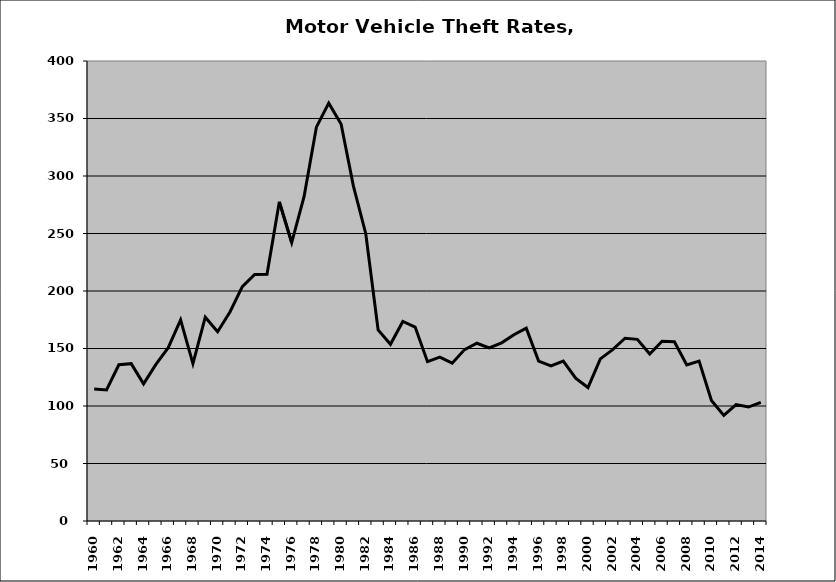
| Category | Motor Vehicle |
|---|---|
| 1960.0 | 114.826 |
| 1961.0 | 113.905 |
| 1962.0 | 135.89 |
| 1963.0 | 136.795 |
| 1964.0 | 119.242 |
| 1965.0 | 136.176 |
| 1966.0 | 150.76 |
| 1967.0 | 174.921 |
| 1968.0 | 136.825 |
| 1969.0 | 177.188 |
| 1970.0 | 164.553 |
| 1971.0 | 181.765 |
| 1972.0 | 203.768 |
| 1973.0 | 214.448 |
| 1974.0 | 214.485 |
| 1975.0 | 277.54 |
| 1976.0 | 242.051 |
| 1977.0 | 282.02 |
| 1978.0 | 342.453 |
| 1979.0 | 363.333 |
| 1980.0 | 345.236 |
| 1981.0 | 291.26 |
| 1982.0 | 249.801 |
| 1983.0 | 166.148 |
| 1984.0 | 153.62 |
| 1985.0 | 173.477 |
| 1986.0 | 168.639 |
| 1987.0 | 138.571 |
| 1988.0 | 142.463 |
| 1989.0 | 137.263 |
| 1990.0 | 149.034 |
| 1991.0 | 154.565 |
| 1992.0 | 150.429 |
| 1993.0 | 154.894 |
| 1994.0 | 161.975 |
| 1995.0 | 167.708 |
| 1996.0 | 139.085 |
| 1997.0 | 134.792 |
| 1998.0 | 139.085 |
| 1999.0 | 124.27 |
| 2000.0 | 116.043 |
| 2001.0 | 140.961 |
| 2002.0 | 148.949 |
| 2003.0 | 158.929 |
| 2004.0 | 157.94 |
| 2005.0 | 145.244 |
| 2006.0 | 156.309 |
| 2007.0 | 155.882 |
| 2008.0 | 135.652 |
| 2009.0 | 139.085 |
| 2010.0 | 104.857 |
| 2011.0 | 91.829 |
| 2012.0 | 101.279 |
| 2013.0 | 99.104 |
| 2014.0 | 103.226 |